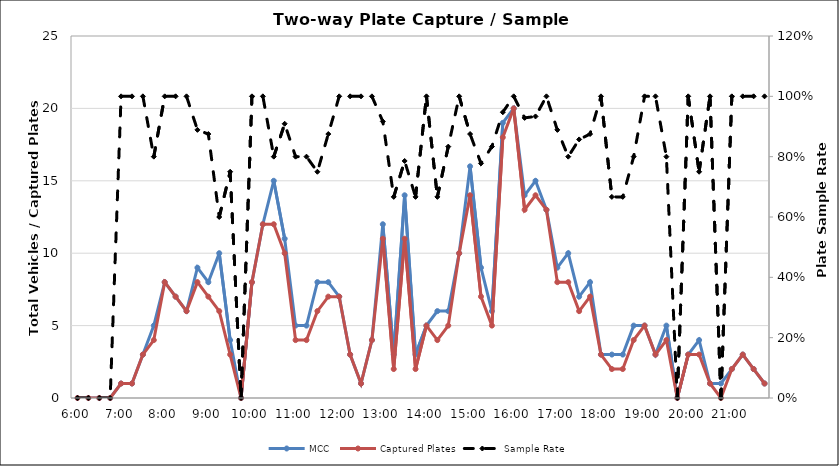
| Category | MCC | Captured Plates |
|---|---|---|
| 0.25 | 0 | 0 |
| 0.260416666666667 | 0 | 0 |
| 0.270833333333333 | 0 | 0 |
| 0.28125 | 0 | 0 |
| 0.291666666666667 | 1 | 1 |
| 0.302083333333333 | 1 | 1 |
| 0.3125 | 3 | 3 |
| 0.322916666666667 | 5 | 4 |
| 0.333333333333333 | 8 | 8 |
| 0.34375 | 7 | 7 |
| 0.354166666666667 | 6 | 6 |
| 0.364583333333333 | 9 | 8 |
| 0.375 | 8 | 7 |
| 0.385416666666667 | 10 | 6 |
| 0.395833333333333 | 4 | 3 |
| 0.40625 | 0 | 0 |
| 0.416666666666667 | 8 | 8 |
| 0.427083333333333 | 12 | 12 |
| 0.4375 | 15 | 12 |
| 0.447916666666667 | 11 | 10 |
| 0.458333333333333 | 5 | 4 |
| 0.46875 | 5 | 4 |
| 0.479166666666667 | 8 | 6 |
| 0.489583333333333 | 8 | 7 |
| 0.5 | 7 | 7 |
| 0.510416666666667 | 3 | 3 |
| 0.520833333333333 | 1 | 1 |
| 0.53125 | 4 | 4 |
| 0.541666666666667 | 12 | 11 |
| 0.552083333333333 | 3 | 2 |
| 0.5625 | 14 | 11 |
| 0.572916666666667 | 3 | 2 |
| 0.583333333333333 | 5 | 5 |
| 0.59375 | 6 | 4 |
| 0.604166666666667 | 6 | 5 |
| 0.614583333333333 | 10 | 10 |
| 0.625 | 16 | 14 |
| 0.635416666666667 | 9 | 7 |
| 0.645833333333333 | 6 | 5 |
| 0.65625 | 19 | 18 |
| 0.666666666666667 | 20 | 20 |
| 0.677083333333333 | 14 | 13 |
| 0.6875 | 15 | 14 |
| 0.697916666666667 | 13 | 13 |
| 0.708333333333333 | 9 | 8 |
| 0.71875 | 10 | 8 |
| 0.729166666666667 | 7 | 6 |
| 0.739583333333333 | 8 | 7 |
| 0.75 | 3 | 3 |
| 0.760416666666667 | 3 | 2 |
| 0.770833333333333 | 3 | 2 |
| 0.78125 | 5 | 4 |
| 0.791666666666667 | 5 | 5 |
| 0.802083333333333 | 3 | 3 |
| 0.8125 | 5 | 4 |
| 0.822916666666667 | 0 | 0 |
| 0.833333333333333 | 3 | 3 |
| 0.84375 | 4 | 3 |
| 0.854166666666667 | 1 | 1 |
| 0.864583333333333 | 1 | 0 |
| 0.875 | 2 | 2 |
| 0.885416666666667 | 3 | 3 |
| 0.895833333333333 | 2 | 2 |
| 0.90625 | 1 | 1 |